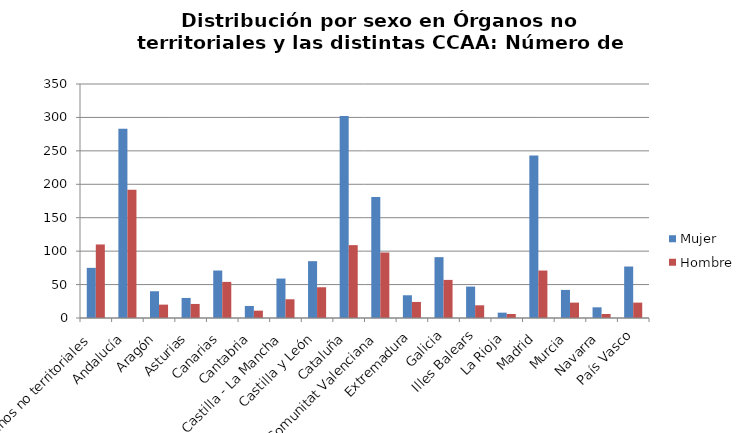
| Category | Mujer | Hombre |
|---|---|---|
| Órganos no territoriales | 75 | 110 |
| Andalucía | 283 | 192 |
| Aragón | 40 | 20 |
| Asturias | 30 | 21 |
| Canarias | 71 | 54 |
| Cantabria | 18 | 11 |
| Castilla - La Mancha | 59 | 28 |
| Castilla y León | 85 | 46 |
| Cataluña | 302 | 109 |
| Comunitat Valenciana | 181 | 98 |
| Extremadura | 34 | 24 |
| Galicia | 91 | 57 |
| Illes Balears | 47 | 19 |
| La Rioja | 8 | 6 |
| Madrid | 243 | 71 |
| Murcia | 42 | 23 |
| Navarra | 16 | 6 |
| País Vasco | 77 | 23 |